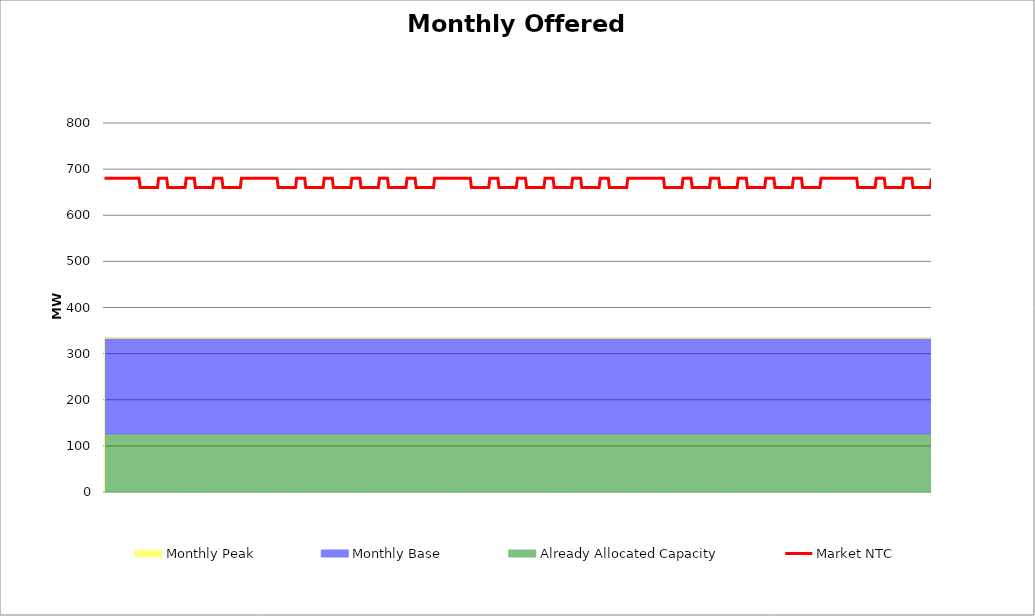
| Category | Market NTC |
|---|---|
| 0 | 680 |
| 1 | 680 |
| 2 | 680 |
| 3 | 680 |
| 4 | 680 |
| 5 | 680 |
| 6 | 680 |
| 7 | 680 |
| 8 | 680 |
| 9 | 680 |
| 10 | 680 |
| 11 | 680 |
| 12 | 680 |
| 13 | 680 |
| 14 | 680 |
| 15 | 680 |
| 16 | 680 |
| 17 | 680 |
| 18 | 680 |
| 19 | 680 |
| 20 | 680 |
| 21 | 680 |
| 22 | 680 |
| 23 | 680 |
| 24 | 680 |
| 25 | 680 |
| 26 | 680 |
| 27 | 680 |
| 28 | 680 |
| 29 | 680 |
| 30 | 680 |
| 31 | 660 |
| 32 | 660 |
| 33 | 660 |
| 34 | 660 |
| 35 | 660 |
| 36 | 660 |
| 37 | 660 |
| 38 | 660 |
| 39 | 660 |
| 40 | 660 |
| 41 | 660 |
| 42 | 660 |
| 43 | 660 |
| 44 | 660 |
| 45 | 660 |
| 46 | 660 |
| 47 | 680 |
| 48 | 680 |
| 49 | 680 |
| 50 | 680 |
| 51 | 680 |
| 52 | 680 |
| 53 | 680 |
| 54 | 680 |
| 55 | 660 |
| 56 | 660 |
| 57 | 660 |
| 58 | 660 |
| 59 | 660 |
| 60 | 660 |
| 61 | 660 |
| 62 | 660 |
| 63 | 660 |
| 64 | 660 |
| 65 | 660 |
| 66 | 660 |
| 67 | 660 |
| 68 | 660 |
| 69 | 660 |
| 70 | 660 |
| 71 | 680 |
| 72 | 680 |
| 73 | 680 |
| 74 | 680 |
| 75 | 680 |
| 76 | 680 |
| 77 | 680 |
| 78 | 680 |
| 79 | 660 |
| 80 | 660 |
| 81 | 660 |
| 82 | 660 |
| 83 | 660 |
| 84 | 660 |
| 85 | 660 |
| 86 | 660 |
| 87 | 660 |
| 88 | 660 |
| 89 | 660 |
| 90 | 660 |
| 91 | 660 |
| 92 | 660 |
| 93 | 660 |
| 94 | 660 |
| 95 | 680 |
| 96 | 680 |
| 97 | 680 |
| 98 | 680 |
| 99 | 680 |
| 100 | 680 |
| 101 | 680 |
| 102 | 680 |
| 103 | 660 |
| 104 | 660 |
| 105 | 660 |
| 106 | 660 |
| 107 | 660 |
| 108 | 660 |
| 109 | 660 |
| 110 | 660 |
| 111 | 660 |
| 112 | 660 |
| 113 | 660 |
| 114 | 660 |
| 115 | 660 |
| 116 | 660 |
| 117 | 660 |
| 118 | 660 |
| 119 | 680 |
| 120 | 680 |
| 121 | 680 |
| 122 | 680 |
| 123 | 680 |
| 124 | 680 |
| 125 | 680 |
| 126 | 680 |
| 127 | 680 |
| 128 | 680 |
| 129 | 680 |
| 130 | 680 |
| 131 | 680 |
| 132 | 680 |
| 133 | 680 |
| 134 | 680 |
| 135 | 680 |
| 136 | 680 |
| 137 | 680 |
| 138 | 680 |
| 139 | 680 |
| 140 | 680 |
| 141 | 680 |
| 142 | 680 |
| 143 | 680 |
| 144 | 680 |
| 145 | 680 |
| 146 | 680 |
| 147 | 680 |
| 148 | 680 |
| 149 | 680 |
| 150 | 680 |
| 151 | 660 |
| 152 | 660 |
| 153 | 660 |
| 154 | 660 |
| 155 | 660 |
| 156 | 660 |
| 157 | 660 |
| 158 | 660 |
| 159 | 660 |
| 160 | 660 |
| 161 | 660 |
| 162 | 660 |
| 163 | 660 |
| 164 | 660 |
| 165 | 660 |
| 166 | 660 |
| 167 | 680 |
| 168 | 680 |
| 169 | 680 |
| 170 | 680 |
| 171 | 680 |
| 172 | 680 |
| 173 | 680 |
| 174 | 680 |
| 175 | 660 |
| 176 | 660 |
| 177 | 660 |
| 178 | 660 |
| 179 | 660 |
| 180 | 660 |
| 181 | 660 |
| 182 | 660 |
| 183 | 660 |
| 184 | 660 |
| 185 | 660 |
| 186 | 660 |
| 187 | 660 |
| 188 | 660 |
| 189 | 660 |
| 190 | 660 |
| 191 | 680 |
| 192 | 680 |
| 193 | 680 |
| 194 | 680 |
| 195 | 680 |
| 196 | 680 |
| 197 | 680 |
| 198 | 680 |
| 199 | 660 |
| 200 | 660 |
| 201 | 660 |
| 202 | 660 |
| 203 | 660 |
| 204 | 660 |
| 205 | 660 |
| 206 | 660 |
| 207 | 660 |
| 208 | 660 |
| 209 | 660 |
| 210 | 660 |
| 211 | 660 |
| 212 | 660 |
| 213 | 660 |
| 214 | 660 |
| 215 | 680 |
| 216 | 680 |
| 217 | 680 |
| 218 | 680 |
| 219 | 680 |
| 220 | 680 |
| 221 | 680 |
| 222 | 680 |
| 223 | 660 |
| 224 | 660 |
| 225 | 660 |
| 226 | 660 |
| 227 | 660 |
| 228 | 660 |
| 229 | 660 |
| 230 | 660 |
| 231 | 660 |
| 232 | 660 |
| 233 | 660 |
| 234 | 660 |
| 235 | 660 |
| 236 | 660 |
| 237 | 660 |
| 238 | 660 |
| 239 | 680 |
| 240 | 680 |
| 241 | 680 |
| 242 | 680 |
| 243 | 680 |
| 244 | 680 |
| 245 | 680 |
| 246 | 680 |
| 247 | 660 |
| 248 | 660 |
| 249 | 660 |
| 250 | 660 |
| 251 | 660 |
| 252 | 660 |
| 253 | 660 |
| 254 | 660 |
| 255 | 660 |
| 256 | 660 |
| 257 | 660 |
| 258 | 660 |
| 259 | 660 |
| 260 | 660 |
| 261 | 660 |
| 262 | 660 |
| 263 | 680 |
| 264 | 680 |
| 265 | 680 |
| 266 | 680 |
| 267 | 680 |
| 268 | 680 |
| 269 | 680 |
| 270 | 680 |
| 271 | 660 |
| 272 | 660 |
| 273 | 660 |
| 274 | 660 |
| 275 | 660 |
| 276 | 660 |
| 277 | 660 |
| 278 | 660 |
| 279 | 660 |
| 280 | 660 |
| 281 | 660 |
| 282 | 660 |
| 283 | 660 |
| 284 | 660 |
| 285 | 660 |
| 286 | 660 |
| 287 | 680 |
| 288 | 680 |
| 289 | 680 |
| 290 | 680 |
| 291 | 680 |
| 292 | 680 |
| 293 | 680 |
| 294 | 680 |
| 295 | 680 |
| 296 | 680 |
| 297 | 680 |
| 298 | 680 |
| 299 | 680 |
| 300 | 680 |
| 301 | 680 |
| 302 | 680 |
| 303 | 680 |
| 304 | 680 |
| 305 | 680 |
| 306 | 680 |
| 307 | 680 |
| 308 | 680 |
| 309 | 680 |
| 310 | 680 |
| 311 | 680 |
| 312 | 680 |
| 313 | 680 |
| 314 | 680 |
| 315 | 680 |
| 316 | 680 |
| 317 | 680 |
| 318 | 680 |
| 319 | 660 |
| 320 | 660 |
| 321 | 660 |
| 322 | 660 |
| 323 | 660 |
| 324 | 660 |
| 325 | 660 |
| 326 | 660 |
| 327 | 660 |
| 328 | 660 |
| 329 | 660 |
| 330 | 660 |
| 331 | 660 |
| 332 | 660 |
| 333 | 660 |
| 334 | 660 |
| 335 | 680 |
| 336 | 680 |
| 337 | 680 |
| 338 | 680 |
| 339 | 680 |
| 340 | 680 |
| 341 | 680 |
| 342 | 680 |
| 343 | 660 |
| 344 | 660 |
| 345 | 660 |
| 346 | 660 |
| 347 | 660 |
| 348 | 660 |
| 349 | 660 |
| 350 | 660 |
| 351 | 660 |
| 352 | 660 |
| 353 | 660 |
| 354 | 660 |
| 355 | 660 |
| 356 | 660 |
| 357 | 660 |
| 358 | 660 |
| 359 | 680 |
| 360 | 680 |
| 361 | 680 |
| 362 | 680 |
| 363 | 680 |
| 364 | 680 |
| 365 | 680 |
| 366 | 680 |
| 367 | 660 |
| 368 | 660 |
| 369 | 660 |
| 370 | 660 |
| 371 | 660 |
| 372 | 660 |
| 373 | 660 |
| 374 | 660 |
| 375 | 660 |
| 376 | 660 |
| 377 | 660 |
| 378 | 660 |
| 379 | 660 |
| 380 | 660 |
| 381 | 660 |
| 382 | 660 |
| 383 | 680 |
| 384 | 680 |
| 385 | 680 |
| 386 | 680 |
| 387 | 680 |
| 388 | 680 |
| 389 | 680 |
| 390 | 680 |
| 391 | 660 |
| 392 | 660 |
| 393 | 660 |
| 394 | 660 |
| 395 | 660 |
| 396 | 660 |
| 397 | 660 |
| 398 | 660 |
| 399 | 660 |
| 400 | 660 |
| 401 | 660 |
| 402 | 660 |
| 403 | 660 |
| 404 | 660 |
| 405 | 660 |
| 406 | 660 |
| 407 | 680 |
| 408 | 680 |
| 409 | 680 |
| 410 | 680 |
| 411 | 680 |
| 412 | 680 |
| 413 | 680 |
| 414 | 680 |
| 415 | 660 |
| 416 | 660 |
| 417 | 660 |
| 418 | 660 |
| 419 | 660 |
| 420 | 660 |
| 421 | 660 |
| 422 | 660 |
| 423 | 660 |
| 424 | 660 |
| 425 | 660 |
| 426 | 660 |
| 427 | 660 |
| 428 | 660 |
| 429 | 660 |
| 430 | 660 |
| 431 | 680 |
| 432 | 680 |
| 433 | 680 |
| 434 | 680 |
| 435 | 680 |
| 436 | 680 |
| 437 | 680 |
| 438 | 680 |
| 439 | 660 |
| 440 | 660 |
| 441 | 660 |
| 442 | 660 |
| 443 | 660 |
| 444 | 660 |
| 445 | 660 |
| 446 | 660 |
| 447 | 660 |
| 448 | 660 |
| 449 | 660 |
| 450 | 660 |
| 451 | 660 |
| 452 | 660 |
| 453 | 660 |
| 454 | 660 |
| 455 | 680 |
| 456 | 680 |
| 457 | 680 |
| 458 | 680 |
| 459 | 680 |
| 460 | 680 |
| 461 | 680 |
| 462 | 680 |
| 463 | 680 |
| 464 | 680 |
| 465 | 680 |
| 466 | 680 |
| 467 | 680 |
| 468 | 680 |
| 469 | 680 |
| 470 | 680 |
| 471 | 680 |
| 472 | 680 |
| 473 | 680 |
| 474 | 680 |
| 475 | 680 |
| 476 | 680 |
| 477 | 680 |
| 478 | 680 |
| 479 | 680 |
| 480 | 680 |
| 481 | 680 |
| 482 | 680 |
| 483 | 680 |
| 484 | 680 |
| 485 | 680 |
| 486 | 680 |
| 487 | 660 |
| 488 | 660 |
| 489 | 660 |
| 490 | 660 |
| 491 | 660 |
| 492 | 660 |
| 493 | 660 |
| 494 | 660 |
| 495 | 660 |
| 496 | 660 |
| 497 | 660 |
| 498 | 660 |
| 499 | 660 |
| 500 | 660 |
| 501 | 660 |
| 502 | 660 |
| 503 | 680 |
| 504 | 680 |
| 505 | 680 |
| 506 | 680 |
| 507 | 680 |
| 508 | 680 |
| 509 | 680 |
| 510 | 680 |
| 511 | 660 |
| 512 | 660 |
| 513 | 660 |
| 514 | 660 |
| 515 | 660 |
| 516 | 660 |
| 517 | 660 |
| 518 | 660 |
| 519 | 660 |
| 520 | 660 |
| 521 | 660 |
| 522 | 660 |
| 523 | 660 |
| 524 | 660 |
| 525 | 660 |
| 526 | 660 |
| 527 | 680 |
| 528 | 680 |
| 529 | 680 |
| 530 | 680 |
| 531 | 680 |
| 532 | 680 |
| 533 | 680 |
| 534 | 680 |
| 535 | 660 |
| 536 | 660 |
| 537 | 660 |
| 538 | 660 |
| 539 | 660 |
| 540 | 660 |
| 541 | 660 |
| 542 | 660 |
| 543 | 660 |
| 544 | 660 |
| 545 | 660 |
| 546 | 660 |
| 547 | 660 |
| 548 | 660 |
| 549 | 660 |
| 550 | 660 |
| 551 | 680 |
| 552 | 680 |
| 553 | 680 |
| 554 | 680 |
| 555 | 680 |
| 556 | 680 |
| 557 | 680 |
| 558 | 680 |
| 559 | 660 |
| 560 | 660 |
| 561 | 660 |
| 562 | 660 |
| 563 | 660 |
| 564 | 660 |
| 565 | 660 |
| 566 | 660 |
| 567 | 660 |
| 568 | 660 |
| 569 | 660 |
| 570 | 660 |
| 571 | 660 |
| 572 | 660 |
| 573 | 660 |
| 574 | 660 |
| 575 | 680 |
| 576 | 680 |
| 577 | 680 |
| 578 | 680 |
| 579 | 680 |
| 580 | 680 |
| 581 | 680 |
| 582 | 680 |
| 583 | 660 |
| 584 | 660 |
| 585 | 660 |
| 586 | 660 |
| 587 | 660 |
| 588 | 660 |
| 589 | 660 |
| 590 | 660 |
| 591 | 660 |
| 592 | 660 |
| 593 | 660 |
| 594 | 660 |
| 595 | 660 |
| 596 | 660 |
| 597 | 660 |
| 598 | 660 |
| 599 | 680 |
| 600 | 680 |
| 601 | 680 |
| 602 | 680 |
| 603 | 680 |
| 604 | 680 |
| 605 | 680 |
| 606 | 680 |
| 607 | 660 |
| 608 | 660 |
| 609 | 660 |
| 610 | 660 |
| 611 | 660 |
| 612 | 660 |
| 613 | 660 |
| 614 | 660 |
| 615 | 660 |
| 616 | 660 |
| 617 | 660 |
| 618 | 660 |
| 619 | 660 |
| 620 | 660 |
| 621 | 660 |
| 622 | 660 |
| 623 | 680 |
| 624 | 680 |
| 625 | 680 |
| 626 | 680 |
| 627 | 680 |
| 628 | 680 |
| 629 | 680 |
| 630 | 680 |
| 631 | 680 |
| 632 | 680 |
| 633 | 680 |
| 634 | 680 |
| 635 | 680 |
| 636 | 680 |
| 637 | 680 |
| 638 | 680 |
| 639 | 680 |
| 640 | 680 |
| 641 | 680 |
| 642 | 680 |
| 643 | 680 |
| 644 | 680 |
| 645 | 680 |
| 646 | 680 |
| 647 | 680 |
| 648 | 680 |
| 649 | 680 |
| 650 | 680 |
| 651 | 680 |
| 652 | 680 |
| 653 | 680 |
| 654 | 680 |
| 655 | 660 |
| 656 | 660 |
| 657 | 660 |
| 658 | 660 |
| 659 | 660 |
| 660 | 660 |
| 661 | 660 |
| 662 | 660 |
| 663 | 660 |
| 664 | 660 |
| 665 | 660 |
| 666 | 660 |
| 667 | 660 |
| 668 | 660 |
| 669 | 660 |
| 670 | 660 |
| 671 | 680 |
| 672 | 680 |
| 673 | 680 |
| 674 | 680 |
| 675 | 680 |
| 676 | 680 |
| 677 | 680 |
| 678 | 680 |
| 679 | 660 |
| 680 | 660 |
| 681 | 660 |
| 682 | 660 |
| 683 | 660 |
| 684 | 660 |
| 685 | 660 |
| 686 | 660 |
| 687 | 660 |
| 688 | 660 |
| 689 | 660 |
| 690 | 660 |
| 691 | 660 |
| 692 | 660 |
| 693 | 660 |
| 694 | 660 |
| 695 | 680 |
| 696 | 680 |
| 697 | 680 |
| 698 | 680 |
| 699 | 680 |
| 700 | 680 |
| 701 | 680 |
| 702 | 680 |
| 703 | 660 |
| 704 | 660 |
| 705 | 660 |
| 706 | 660 |
| 707 | 660 |
| 708 | 660 |
| 709 | 660 |
| 710 | 660 |
| 711 | 660 |
| 712 | 660 |
| 713 | 660 |
| 714 | 660 |
| 715 | 660 |
| 716 | 660 |
| 717 | 660 |
| 718 | 660 |
| 719 | 680 |